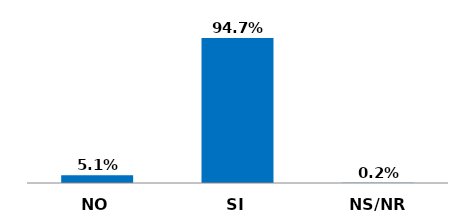
| Category | Series 0 |
|---|---|
| NO | 0.051 |
| SI | 0.947 |
| NS/NR | 0.002 |